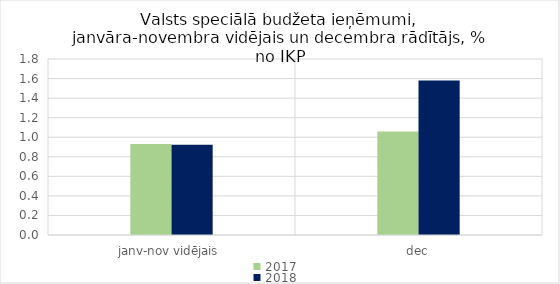
| Category | 2017 | 2018 |
|---|---|---|
| janv-nov vidējais | 0.93 | 0.924 |
| dec | 1.058 | 1.58 |